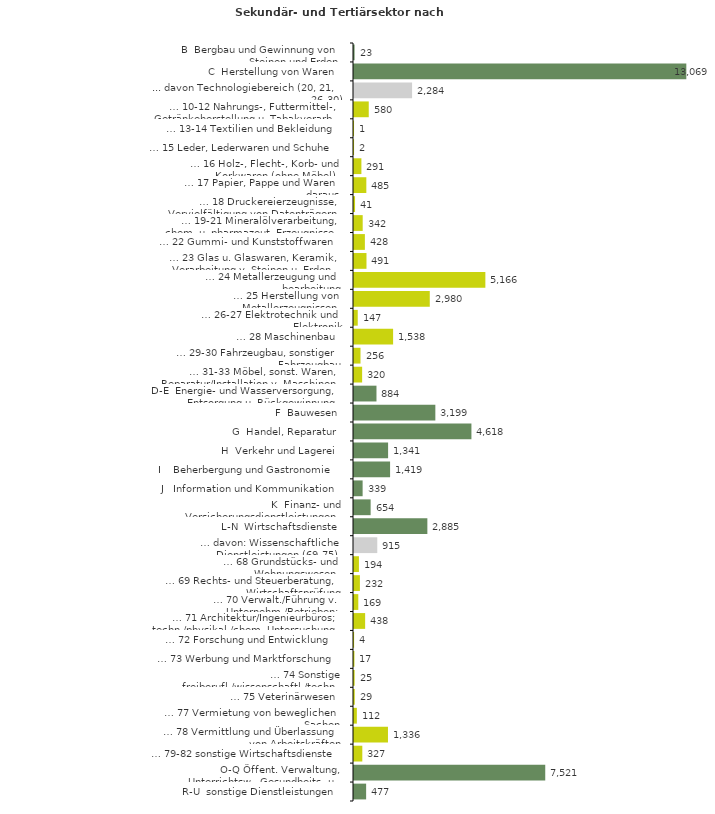
| Category | Series 0 |
|---|---|
| B  Bergbau und Gewinnung von Steinen und Erden | 23 |
| C  Herstellung von Waren | 13069 |
| ... davon Technologiebereich (20, 21, 26-30) | 2284 |
| … 10-12 Nahrungs-, Futtermittel-, Getränkeherstellung u. Tabakverarb. | 580 |
| … 13-14 Textilien und Bekleidung | 1 |
| … 15 Leder, Lederwaren und Schuhe | 2 |
| … 16 Holz-, Flecht-, Korb- und Korkwaren (ohne Möbel)  | 291 |
| … 17 Papier, Pappe und Waren daraus  | 485 |
| … 18 Druckereierzeugnisse, Vervielfältigung von Datenträgern | 41 |
| … 19-21 Mineralölverarbeitung, chem. u. pharmazeut. Erzeugnisse | 342 |
| … 22 Gummi- und Kunststoffwaren | 428 |
| … 23 Glas u. Glaswaren, Keramik, Verarbeitung v. Steinen u. Erden  | 491 |
| … 24 Metallerzeugung und -bearbeitung | 5166 |
| … 25 Herstellung von Metallerzeugnissen  | 2980 |
| … 26-27 Elektrotechnik und Elektronik | 147 |
| … 28 Maschinenbau | 1538 |
| … 29-30 Fahrzeugbau, sonstiger Fahrzeugbau | 256 |
| … 31-33 Möbel, sonst. Waren, Reparatur/Installation v. Maschinen | 320 |
| D-E  Energie- und Wasserversorgung, Entsorgung u. Rückgewinnung | 884 |
| F  Bauwesen | 3199 |
| G  Handel, Reparatur | 4618 |
| H  Verkehr und Lagerei | 1341 |
| I    Beherbergung und Gastronomie | 1419 |
| J   Information und Kommunikation | 339 |
| K  Finanz- und Versicherungsdienstleistungen | 654 |
| L-N  Wirtschaftsdienste | 2885 |
| … davon: Wissenschaftliche Dienstleistungen (69-75) | 915 |
| … 68 Grundstücks- und Wohnungswesen  | 194 |
| … 69 Rechts- und Steuerberatung, Wirtschaftsprüfung | 232 |
| … 70 Verwalt./Führung v. Unternehm./Betrieben; Unternehmensberat. | 169 |
| … 71 Architektur/Ingenieurbüros; techn./physikal./chem. Untersuchung | 438 |
| … 72 Forschung und Entwicklung  | 4 |
| … 73 Werbung und Marktforschung | 17 |
| … 74 Sonstige freiberufl./wissenschaftl./techn. Tätigkeiten | 25 |
| … 75 Veterinärwesen | 29 |
| … 77 Vermietung von beweglichen Sachen  | 112 |
| … 78 Vermittlung und Überlassung von Arbeitskräften | 1336 |
| … 79-82 sonstige Wirtschaftsdienste | 327 |
| O-Q Öffent. Verwaltung, Unterrichtsw., Gesundheits- u. Sozialwesen | 7521 |
| R-U  sonstige Dienstleistungen | 477 |